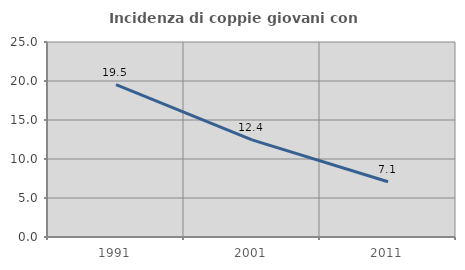
| Category | Incidenza di coppie giovani con figli |
|---|---|
| 1991.0 | 19.543 |
| 2001.0 | 12.449 |
| 2011.0 | 7.078 |